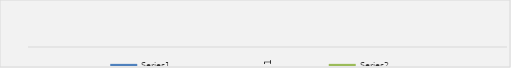
| Category | Series 0 | Series 2 |
|---|---|---|
| 0 | 1 | 1 |